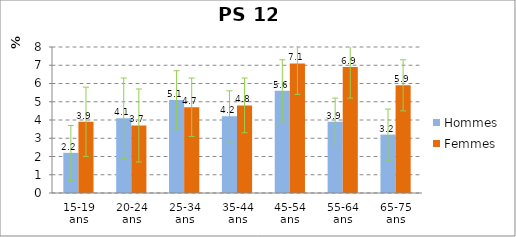
| Category | Hommes | Femmes |
|---|---|---|
| 15-19 ans | 2.2 | 3.9 |
| 20-24 ans | 4.1 | 3.7 |
| 25-34 ans | 5.1 | 4.7 |
| 35-44 ans | 4.2 | 4.8 |
| 45-54 ans | 5.6 | 7.1 |
| 55-64 ans | 3.9 | 6.9 |
| 65-75 ans | 3.2 | 5.9 |